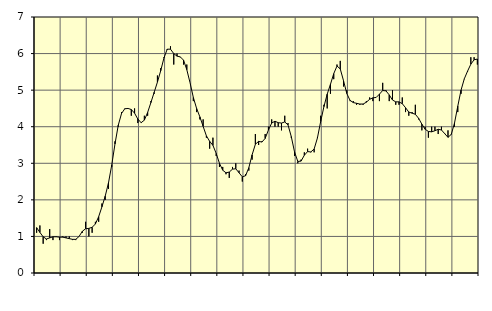
| Category | Piggar | Series 1 |
|---|---|---|
| nan | 1.1 | 1.24 |
| 87.0 | 1.3 | 1.11 |
| 87.0 | 0.8 | 0.99 |
| 87.0 | 0.9 | 0.93 |
| nan | 1.2 | 0.96 |
| 88.0 | 0.9 | 0.99 |
| 88.0 | 1 | 0.99 |
| 88.0 | 0.9 | 0.98 |
| nan | 1 | 0.98 |
| 89.0 | 1 | 0.96 |
| 89.0 | 1 | 0.94 |
| 89.0 | 0.9 | 0.92 |
| nan | 0.9 | 0.92 |
| 90.0 | 1 | 1 |
| 90.0 | 1.1 | 1.14 |
| 90.0 | 1.4 | 1.21 |
| nan | 1 | 1.22 |
| 91.0 | 1.1 | 1.25 |
| 91.0 | 1.4 | 1.34 |
| 91.0 | 1.4 | 1.54 |
| nan | 1.9 | 1.81 |
| 92.0 | 2 | 2.1 |
| 92.0 | 2.3 | 2.46 |
| 92.0 | 2.9 | 2.95 |
| nan | 3.6 | 3.53 |
| 93.0 | 4 | 4.04 |
| 93.0 | 4.4 | 4.36 |
| 93.0 | 4.5 | 4.49 |
| nan | 4.5 | 4.5 |
| 94.0 | 4.3 | 4.47 |
| 94.0 | 4.5 | 4.37 |
| 94.0 | 4.1 | 4.21 |
| nan | 4.1 | 4.11 |
| 95.0 | 4.3 | 4.18 |
| 95.0 | 4.3 | 4.39 |
| 95.0 | 4.7 | 4.66 |
| nan | 4.9 | 4.94 |
| 96.0 | 5.4 | 5.22 |
| 96.0 | 5.6 | 5.53 |
| 96.0 | 5.9 | 5.88 |
| nan | 6.1 | 6.12 |
| 97.0 | 6.2 | 6.12 |
| 97.0 | 5.7 | 6 |
| 97.0 | 6 | 5.93 |
| nan | 5.9 | 5.91 |
| 98.0 | 5.7 | 5.82 |
| 98.0 | 5.7 | 5.56 |
| 98.0 | 5.2 | 5.2 |
| nan | 4.7 | 4.8 |
| 99.0 | 4.4 | 4.5 |
| 99.0 | 4.2 | 4.27 |
| 99.0 | 4.2 | 4.01 |
| nan | 3.7 | 3.75 |
| 0.0 | 3.4 | 3.6 |
| 0.0 | 3.7 | 3.49 |
| 0.0 | 3.2 | 3.27 |
| nan | 2.9 | 3 |
| 1.0 | 2.9 | 2.81 |
| 1.0 | 2.7 | 2.74 |
| 1.0 | 2.6 | 2.76 |
| nan | 2.9 | 2.84 |
| 2.0 | 3 | 2.85 |
| 2.0 | 2.8 | 2.74 |
| 2.0 | 2.5 | 2.63 |
| nan | 2.7 | 2.66 |
| 3.0 | 2.8 | 2.88 |
| 3.0 | 3.1 | 3.23 |
| 3.0 | 3.8 | 3.52 |
| nan | 3.5 | 3.6 |
| 4.0 | 3.6 | 3.58 |
| 4.0 | 3.8 | 3.68 |
| 4.0 | 4 | 3.91 |
| nan | 4.2 | 4.1 |
| 5.0 | 4 | 4.15 |
| 5.0 | 4 | 4.11 |
| 5.0 | 3.9 | 4.1 |
| nan | 4.3 | 4.13 |
| 6.0 | 4.1 | 4.05 |
| 6.0 | 3.7 | 3.73 |
| 6.0 | 3.2 | 3.31 |
| nan | 3 | 3.05 |
| 7.0 | 3.1 | 3.06 |
| 7.0 | 3.3 | 3.22 |
| 7.0 | 3.4 | 3.32 |
| nan | 3.3 | 3.31 |
| 8.0 | 3.3 | 3.39 |
| 8.0 | 3.7 | 3.69 |
| 8.0 | 4.3 | 4.14 |
| nan | 4.6 | 4.55 |
| 9.0 | 4.5 | 4.89 |
| 9.0 | 4.9 | 5.16 |
| 9.0 | 5.3 | 5.45 |
| nan | 5.7 | 5.66 |
| 10.0 | 5.8 | 5.58 |
| 10.0 | 5.1 | 5.26 |
| 10.0 | 5 | 4.91 |
| nan | 4.7 | 4.72 |
| 11.0 | 4.7 | 4.66 |
| 11.0 | 4.6 | 4.64 |
| 11.0 | 4.6 | 4.62 |
| nan | 4.6 | 4.62 |
| 12.0 | 4.7 | 4.67 |
| 12.0 | 4.8 | 4.75 |
| 12.0 | 4.7 | 4.79 |
| nan | 4.8 | 4.8 |
| 13.0 | 4.7 | 4.89 |
| 13.0 | 5.2 | 4.99 |
| 13.0 | 5 | 4.98 |
| nan | 4.7 | 4.87 |
| 14.0 | 5 | 4.73 |
| 14.0 | 4.6 | 4.68 |
| 14.0 | 4.6 | 4.68 |
| nan | 4.8 | 4.63 |
| 15.0 | 4.4 | 4.52 |
| 15.0 | 4.3 | 4.4 |
| 15.0 | 4.4 | 4.37 |
| nan | 4.6 | 4.34 |
| 16.0 | 4.2 | 4.23 |
| 16.0 | 3.9 | 4.07 |
| 16.0 | 4 | 3.93 |
| nan | 3.7 | 3.87 |
| 17.0 | 4 | 3.86 |
| 17.0 | 4 | 3.89 |
| 17.0 | 3.8 | 3.93 |
| nan | 4 | 3.91 |
| 18.0 | 3.8 | 3.81 |
| 18.0 | 3.9 | 3.71 |
| 18.0 | 3.8 | 3.79 |
| nan | 4 | 4.1 |
| 19.0 | 4.4 | 4.56 |
| 19.0 | 4.9 | 5 |
| 19.0 | 5.3 | 5.31 |
| nan | 5.5 | 5.52 |
| 20.0 | 5.9 | 5.71 |
| 20.0 | 5.9 | 5.83 |
| 20.0 | 5.7 | 5.85 |